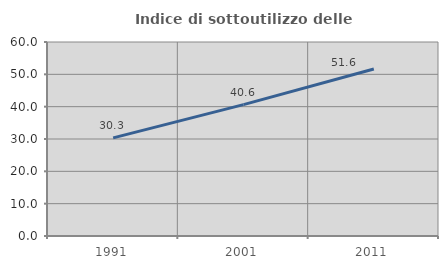
| Category | Indice di sottoutilizzo delle abitazioni  |
|---|---|
| 1991.0 | 30.343 |
| 2001.0 | 40.643 |
| 2011.0 | 51.642 |